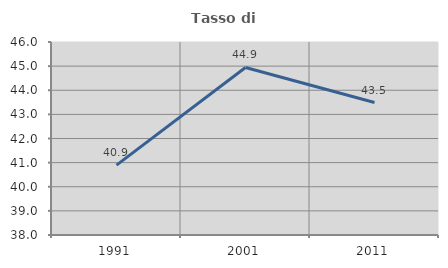
| Category | Tasso di occupazione   |
|---|---|
| 1991.0 | 40.898 |
| 2001.0 | 44.944 |
| 2011.0 | 43.49 |